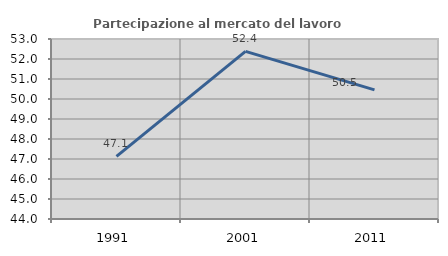
| Category | Partecipazione al mercato del lavoro  femminile |
|---|---|
| 1991.0 | 47.127 |
| 2001.0 | 52.379 |
| 2011.0 | 50.459 |